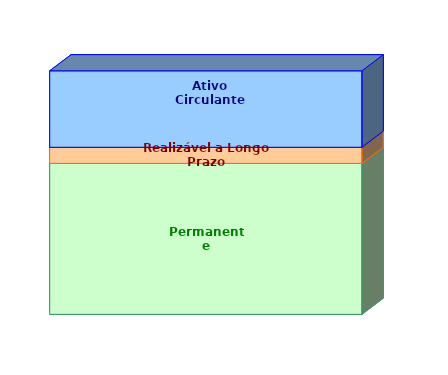
| Category | Permanente | Realizável a Longo Prazo | Ativo Circulante |
|---|---|---|---|
| 0 | 0.62 | 0.066 | 0.314 |